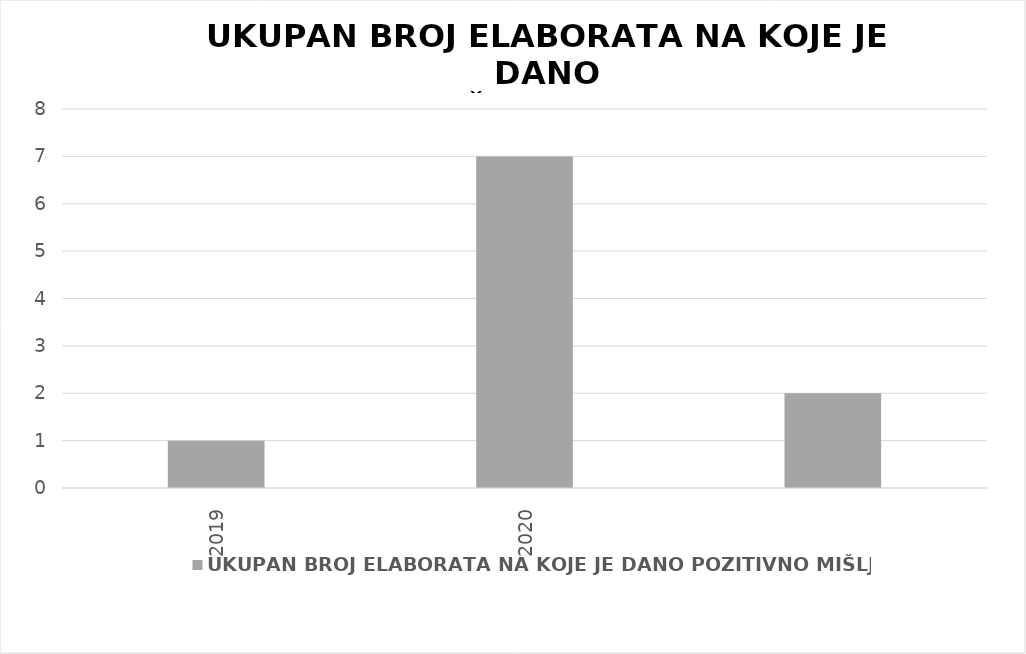
| Category | UKUPAN BROJ ELABORATA NA KOJE JE DANO POZITIVNO MIŠLJENJE |
|---|---|
| 2019.0 | 1 |
| 2020.0 | 7 |
| nan | 2 |